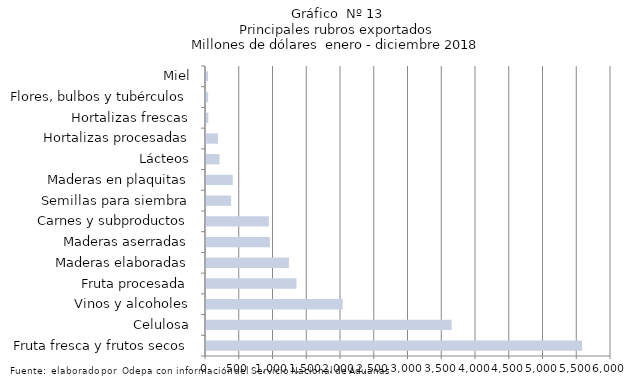
| Category | Series 7 |
|---|---|
| Fruta fresca y frutos secos | 5571087.692 |
| Celulosa | 3638986.705 |
| Vinos y alcoholes | 2025299.221 |
| Fruta procesada | 1339687.181 |
| Maderas elaboradas | 1228858.254 |
| Maderas aserradas | 946821.21 |
| Carnes y subproductos | 931705.569 |
| Semillas para siembra | 372161.711 |
| Maderas en plaquitas | 395854.298 |
| Lácteos | 199859.21 |
| Hortalizas procesadas | 176900.562 |
| Hortalizas frescas | 35421.893 |
| Flores, bulbos y tubérculos | 32499.707 |
| Miel | 29045.077 |